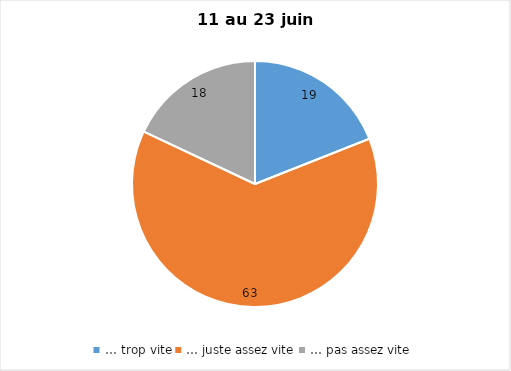
| Category | Series 0 |
|---|---|
| … trop vite | 19 |
| … juste assez vite | 63 |
| … pas assez vite | 18 |